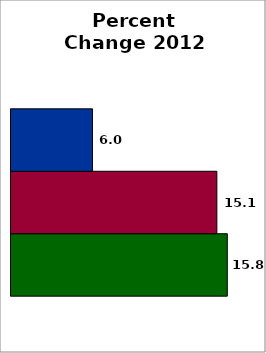
| Category | School | SREB states (average) | 50 states and D.C. (average) |
|---|---|---|---|
| 0 | 15.827 | 15.062 | 5.96 |